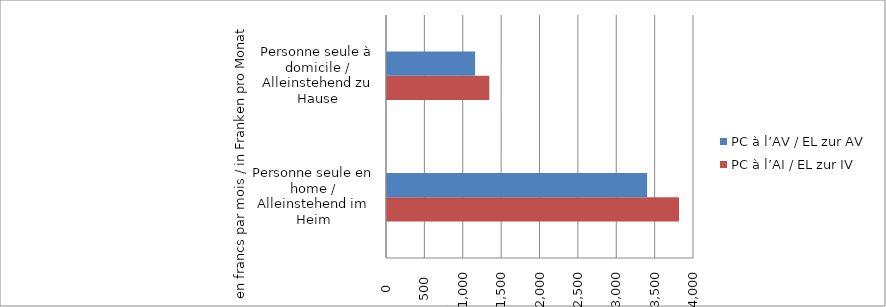
| Category | PC à l’AI / EL zur IV | PC à l’AV / EL zur AV |
|---|---|---|
| Personne seule en home / Alleinstehend im Heim | 3805 | 3389 |
| Personne seule à domicile / Alleinstehend zu Hause | 1333 | 1148 |